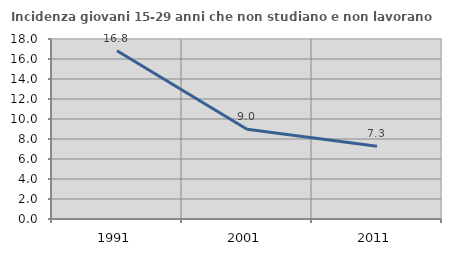
| Category | Incidenza giovani 15-29 anni che non studiano e non lavorano  |
|---|---|
| 1991.0 | 16.823 |
| 2001.0 | 8.974 |
| 2011.0 | 7.273 |